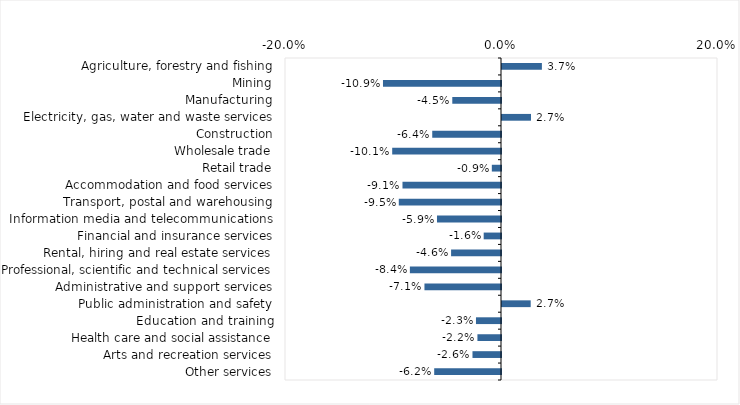
| Category | This week |
|---|---|
| Agriculture, forestry and fishing | 0.037 |
| Mining | -0.109 |
| Manufacturing | -0.045 |
| Electricity, gas, water and waste services | 0.027 |
| Construction | -0.064 |
| Wholesale trade | -0.101 |
| Retail trade | -0.009 |
| Accommodation and food services | -0.091 |
| Transport, postal and warehousing | -0.095 |
| Information media and telecommunications | -0.059 |
| Financial and insurance services | -0.016 |
| Rental, hiring and real estate services | -0.046 |
| Professional, scientific and technical services | -0.084 |
| Administrative and support services | -0.071 |
| Public administration and safety | 0.027 |
| Education and training | -0.023 |
| Health care and social assistance | -0.022 |
| Arts and recreation services | -0.026 |
| Other services | -0.062 |